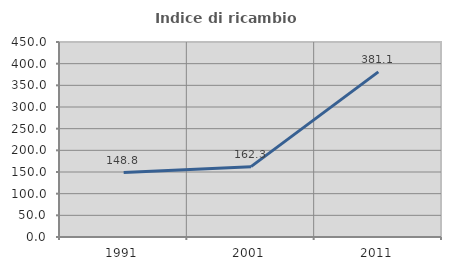
| Category | Indice di ricambio occupazionale  |
|---|---|
| 1991.0 | 148.837 |
| 2001.0 | 162.338 |
| 2011.0 | 381.081 |